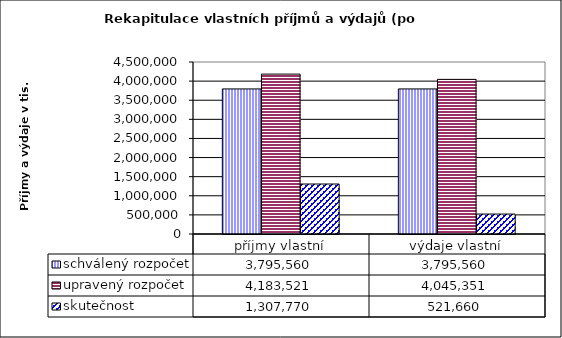
| Category | schválený rozpočet | upravený rozpočet | skutečnost |
|---|---|---|---|
| příjmy vlastní | 3795560 | 4183521 | 1307770 |
| výdaje vlastní | 3795560 | 4045351 | 521660 |